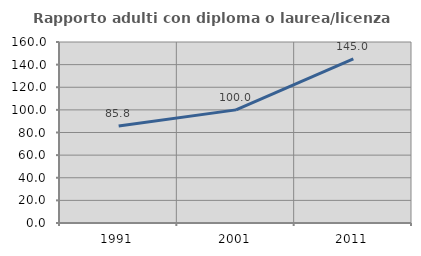
| Category | Rapporto adulti con diploma o laurea/licenza media  |
|---|---|
| 1991.0 | 85.784 |
| 2001.0 | 100 |
| 2011.0 | 145.035 |